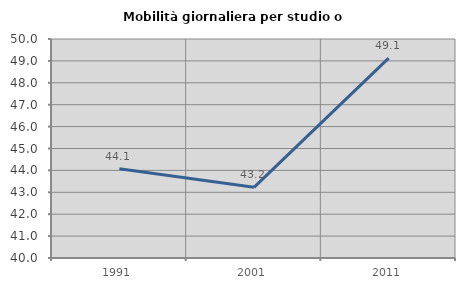
| Category | Mobilità giornaliera per studio o lavoro |
|---|---|
| 1991.0 | 44.071 |
| 2001.0 | 43.228 |
| 2011.0 | 49.13 |